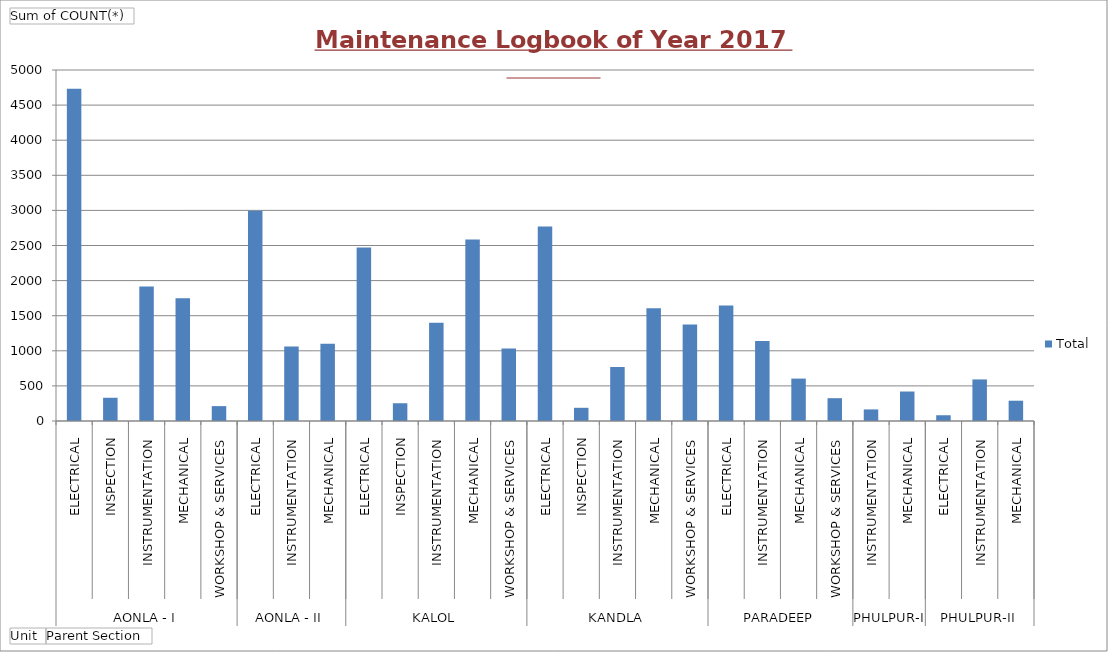
| Category | Total |
|---|---|
| 0 | 4732 |
| 1 | 331 |
| 2 | 1915 |
| 3 | 1750 |
| 4 | 212 |
| 5 | 2994 |
| 6 | 1061 |
| 7 | 1101 |
| 8 | 2471 |
| 9 | 253 |
| 10 | 1398 |
| 11 | 2585 |
| 12 | 1034 |
| 13 | 2771 |
| 14 | 188 |
| 15 | 769 |
| 16 | 1605 |
| 17 | 1375 |
| 18 | 1647 |
| 19 | 1138 |
| 20 | 604 |
| 21 | 325 |
| 22 | 165 |
| 23 | 420 |
| 24 | 82 |
| 25 | 592 |
| 26 | 289 |